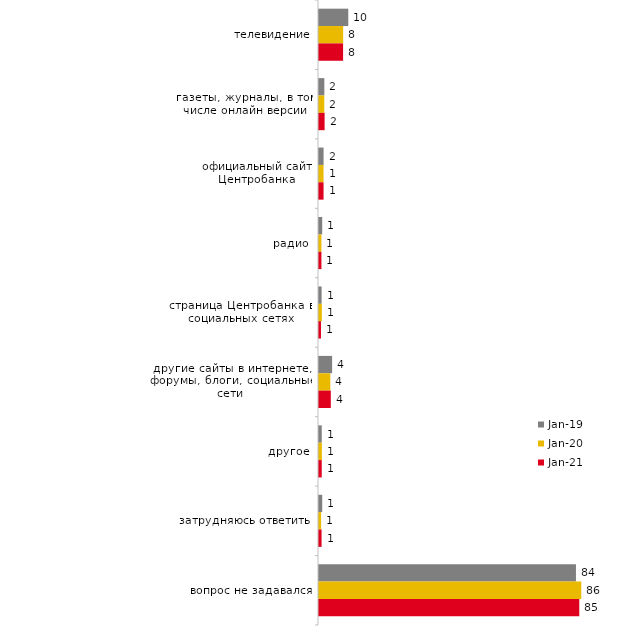
| Category | янв.19 | янв.20 | янв.21 |
|---|---|---|---|
| телевидение | 9.6 | 7.921 | 7.899 |
| газеты, журналы, в том числе онлайн версии | 1.75 | 1.733 | 1.838 |
| официальный сайт Центробанка | 1.5 | 1.485 | 1.49 |
| радио | 1.05 | 0.792 | 0.795 |
| страница Центробанка в социальных сетях | 0.85 | 0.941 | 0.646 |
| другие сайты в интернете, форумы, блоги, социальные сети | 4.3 | 3.713 | 3.875 |
| другое | 0.9 | 0.941 | 0.894 |
| затрудняюсь ответить | 1.05 | 0.693 | 0.845 |
| вопрос не задавался | 84.25 | 85.99 | 85.345 |